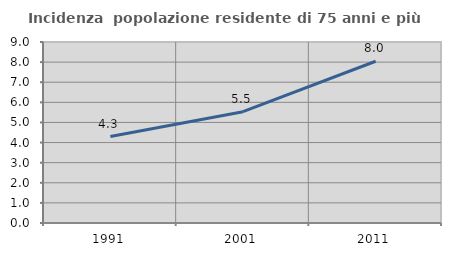
| Category | Incidenza  popolazione residente di 75 anni e più |
|---|---|
| 1991.0 | 4.301 |
| 2001.0 | 5.535 |
| 2011.0 | 8.043 |